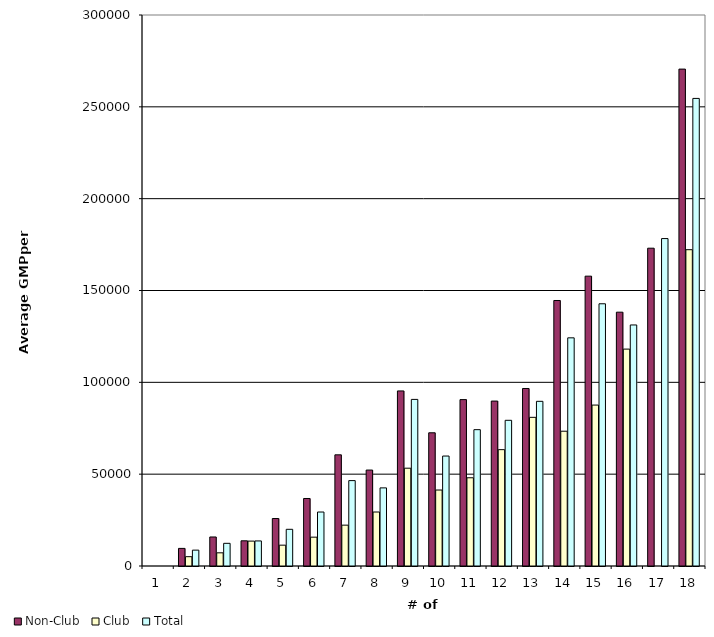
| Category | Non-Club | Club | Total |
|---|---|---|---|
| 1.0 | 0 | 0 | 0 |
| 2.0 | 9579.715 | 5077.34 | 8641.72 |
| 3.0 | 15799.895 | 7174.058 | 12349.56 |
| 4.0 | 13714.174 | 13556.366 | 13646.542 |
| 5.0 | 25850.901 | 11345.136 | 19979.52 |
| 6.0 | 36756.967 | 15697.621 | 29386.196 |
| 7.0 | 60535.638 | 22239.701 | 46493.795 |
| 8.0 | 52234.742 | 29396.022 | 42528.286 |
| 9.0 | 95320.57 | 53254.808 | 90708.096 |
| 10.0 | 72524.697 | 41364.857 | 59866.012 |
| 11.0 | 90593.41 | 48039.462 | 74226.507 |
| 12.0 | 89797.53 | 63349.961 | 79328.7 |
| 13.0 | 96648.752 | 80938.67 | 89666.493 |
| 14.0 | 144559.874 | 73389.464 | 124225.471 |
| 15.0 | 157808.607 | 87624.035 | 142769.056 |
| 16.0 | 138199.976 | 118094.231 | 131240.295 |
| 17.0 | 173032.412 | 0 | 178274.273 |
| 18.0 | 270544.143 | 172217.228 | 254586.168 |